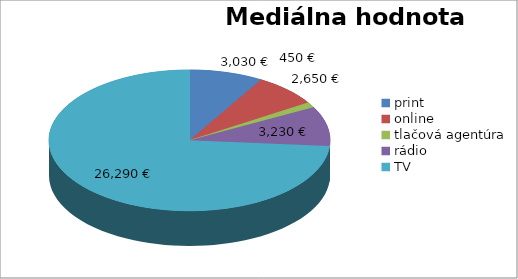
| Category | Mediálna hodnota výstupov |
|---|---|
| print | 3030 |
| online | 2650 |
| tlačová agentúra | 450 |
| rádio | 3230 |
| TV | 26290 |